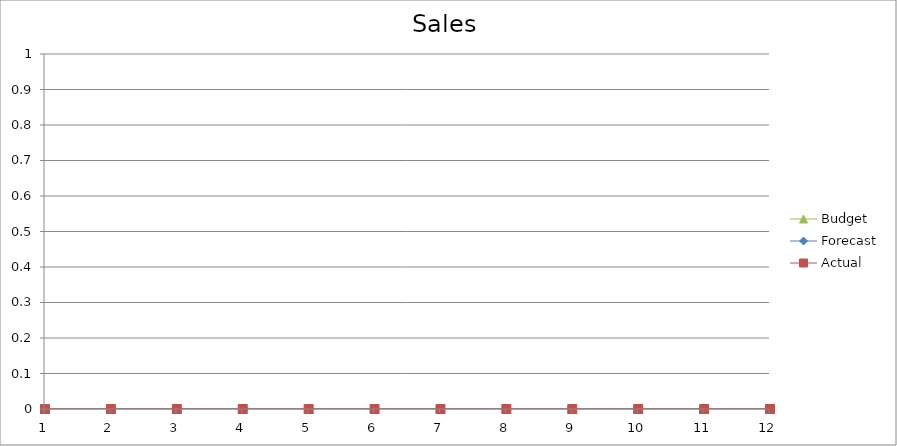
| Category | Budget | Forecast | Actual |
|---|---|---|---|
| 0 | 2310 | 3450 | 920 |
| 1 | 650 | 3320 | 2240 |
| 2 | 1740 | 610 | 560 |
| 3 | 3310 | 1480 | 670 |
| 4 | 2340 | 3090 | 950 |
| 5 | 2560 | 2250 | 1320 |
| 6 | 1760 | 1900 | 1280 |
| 7 | 2380 | 2550 | 1750 |
| 8 | 1310 | 980 | 3350 |
| 9 | 1810 | 1960 | 600 |
| 10 | 2050 | 2720 | 1610 |
| 11 | 1570 | 1950 | 2960 |